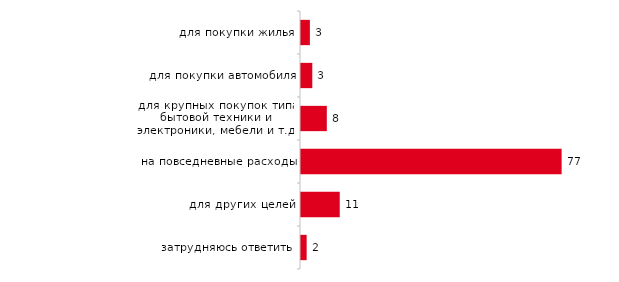
| Category | Series 0 |
|---|---|
| для покупки жилья | 2.619 |
| для покупки автомобиля | 3.333 |
| для крупных покупок типа бытовой техники и электроники, мебели и т.д. | 7.619 |
| на повседневные расходы | 76.905 |
| для других целей | 11.429 |
| затрудняюсь ответить | 1.667 |